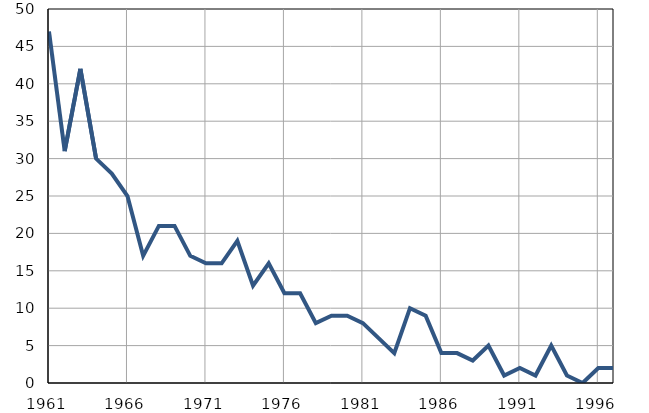
| Category | Умрла 
одојчад |
|---|---|
| 1961.0 | 47 |
| 1962.0 | 31 |
| 1963.0 | 42 |
| 1964.0 | 30 |
| 1965.0 | 28 |
| 1966.0 | 25 |
| 1967.0 | 17 |
| 1968.0 | 21 |
| 1969.0 | 21 |
| 1970.0 | 17 |
| 1971.0 | 16 |
| 1972.0 | 16 |
| 1973.0 | 19 |
| 1974.0 | 13 |
| 1975.0 | 16 |
| 1976.0 | 12 |
| 1977.0 | 12 |
| 1978.0 | 8 |
| 1979.0 | 9 |
| 1980.0 | 9 |
| 1981.0 | 8 |
| 1982.0 | 6 |
| 1983.0 | 4 |
| 1984.0 | 10 |
| 1985.0 | 9 |
| 1986.0 | 4 |
| 1987.0 | 4 |
| 1988.0 | 3 |
| 1989.0 | 5 |
| 1990.0 | 1 |
| 1991.0 | 2 |
| 1992.0 | 1 |
| 1993.0 | 5 |
| 1994.0 | 1 |
| 1995.0 | 0 |
| 1996.0 | 2 |
| 1997.0 | 2 |